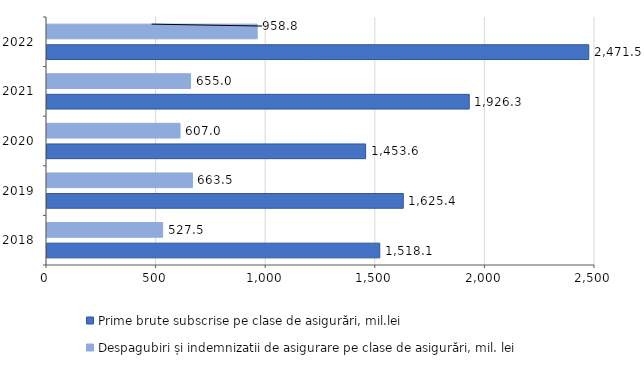
| Category | Prime brute subscrise pe clase de asigurări, mil.lei | Despagubiri și indemnizatii de asigurare pe clase de asigurări, mil. lei |
|---|---|---|
| 2018.0 | 1518.136 | 527.53 |
| 2019.0 | 1625.396 | 663.517 |
| 2020.0 | 1453.553 | 606.951 |
| 2021.0 | 1926.302 | 655.036 |
| 2022.0 | 2471.505 | 958.845 |